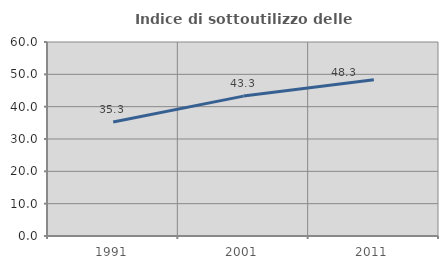
| Category | Indice di sottoutilizzo delle abitazioni  |
|---|---|
| 1991.0 | 35.266 |
| 2001.0 | 43.266 |
| 2011.0 | 48.305 |